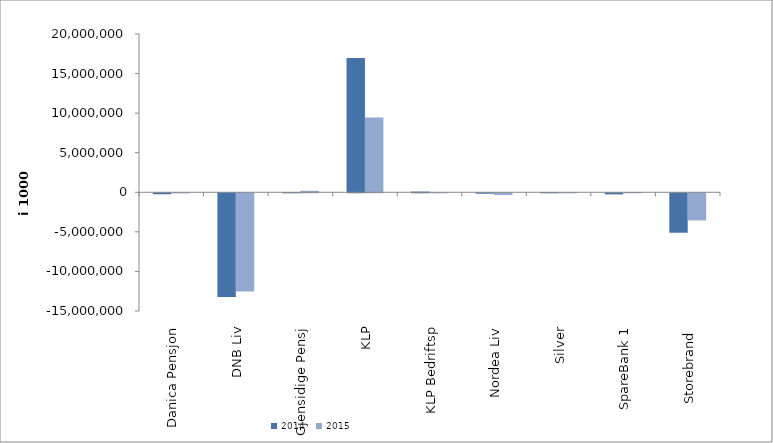
| Category | 2014 | 2015 |
|---|---|---|
| Danica Pensjon | -121184.308 | -16822.71 |
| DNB Liv | -13095612 | -12415067 |
| Gjensidige Pensj | 18195.29 | 192450.349 |
| KLP | 16966340.515 | 9455551.919 |
| KLP Bedriftsp | 88041 | 1168 |
| Nordea Liv | -53231.86 | -225515.17 |
| Silver | 26943.539 | 6957.17 |
| SpareBank 1 | -136427.906 | 38496.616 |
| Storebrand  | -4986542.541 | -3428844.619 |